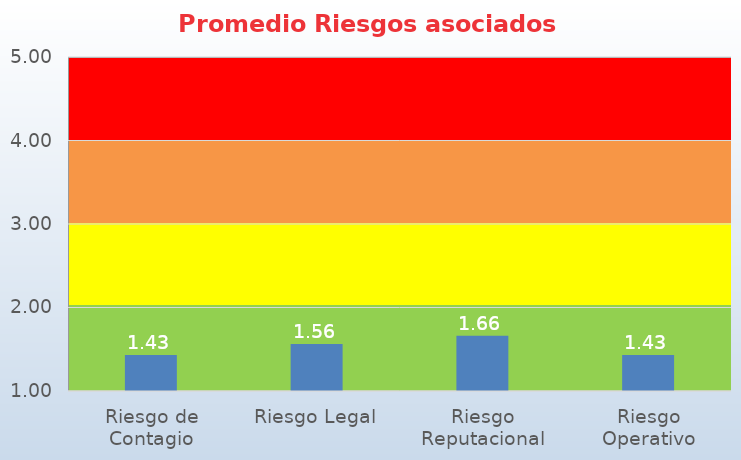
| Category | Series 0 |
|---|---|
| Riesgo de Contagio | 1.431 |
| Riesgo Legal | 1.562 |
| Riesgo Reputacional | 1.662 |
| Riesgo Operativo | 1.431 |